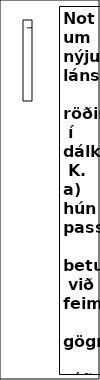
| Category | Lánsfjárafgangur | munur tekjuafg |
|---|---|---|
| 2002-01-14 18:00:00 | -24.52 | 0 |
| 2002-02-14 04:30:00 | -31.58 | 0 |
| 2002-03-16 15:00:00 | -6.83 | 0 |
| 2002-04-16 01:30:00 | -4.93 | 0 |
| 2002-05-16 12:00:00 | -11.93 | 0 |
| 2002-06-15 22:30:00 | -11.68 | 0 |
| 2002-07-16 09:00:00 | -21.55 | 0 |
| 2002-08-15 19:30:00 | -18.9 | 0 |
| 2002-09-15 06:00:00 | -17.19 | 0 |
| 2002-10-15 16:30:00 | -14.6 | 0 |
| 2002-11-15 03:00:00 | -3.89 | 0 |
| 2002-12-15 13:30:00 | 13.39 | 0 |
| 2003-01-15 | 13.99 | 0 |
| 2003-02-14 10:30:00 | 12.36 | 0 |
| 2003-03-16 21:00:00 | -6.95 | 0 |
| 2003-04-16 19:30:00 | -14.1 | 0 |
| 2003-05-17 06:00:00 | -20.48 | 0 |
| 2003-06-16 16:30:00 | -25.21 | 0 |
| 2003-07-17 03:00:00 | -10.26 | 0 |
| 2003-08-17 | -21.78 | 0 |
| 2003-09-17 | -11.26 | 0 |
| 2003-10-17 | -9.03 | 0 |
| 2003-11-17 | -3.58 | 0 |
| 2003-12-17 | 16.57 | 0 |
| 2004-01-17 | 20.19 | 0 |
| 2004-02-17 | 18.53 | 0 |
| 2004-03-17 | 19.07 | 0 |
| 2004-04-17 | 0.59 | 0 |
| 2004-05-17 | -2.92 | 0 |
| 2004-06-17 | -2.97 | 0 |
| 2004-07-17 | -15.68 | 0 |
| 2004-08-17 | 1.74 | 0 |
| 2004-09-17 | -2.88 | 0 |
| 2004-10-17 | 6.06 | 0 |
| 2004-11-17 | 23.2 | 0 |
| 2004-12-17 | 23.45 | 0 |
| 2005-01-17 | 29.21 | 0 |
| 2005-02-17 | 30.4 | 0 |
| 2005-03-17 | 25.2 | 0 |
| 2005-04-17 | 16.93 | 0 |
| 2005-05-17 | 11.14 | 0 |
| 2005-06-17 | 7.41 | 0 |
| 2005-07-17 | 0.13 | 0 |
| 2005-08-17 | 7.58 | 0 |
| 2005-09-17 | 4.62 | 0 |
| 2005-10-17 | 3.49 | 0 |
| 2005-11-17 | 10.2 | 0 |
| 2005-12-17 | 9.48 | 0 |